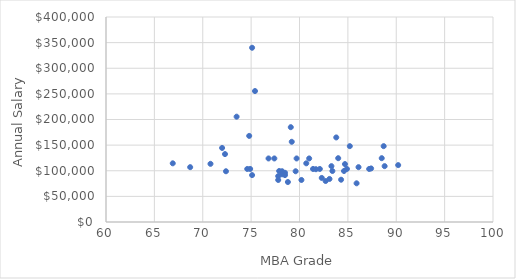
| Category | Annual Salary |
|---|---|
| 90.2 | 111000 |
| 68.7 | 107000 |
| 83.3 | 109000 |
| 88.7 | 148000 |
| 75.4 | 255500 |
| 82.1 | 103500 |
| 66.9 | 114500 |
| 76.8 | 124000 |
| 72.3 | 132500 |
| 72.4 | 99000 |
| 81.0 | 124000 |
| 77.8 | 82000 |
| 79.1 | 185000 |
| 77.8 | 89500 |
| 75.1 | 91500 |
| 70.8 | 113500 |
| 79.6 | 99000 |
| 85.9 | 75500 |
| 82.3 | 86000 |
| 79.2 | 156500 |
| 83.4 | 99500 |
| 85.2 | 148000 |
| 80.2 | 82000 |
| 87.2 | 103500 |
| 73.5 | 205500 |
| 74.6 | 103500 |
| 75.1 | 340000 |
| 74.9 | 103500 |
| 84.6 | 99500 |
| 81.7 | 103000 |
| 81.4 | 103500 |
| 83.8 | 165000 |
| 88.5 | 124500 |
| 84.9 | 103500 |
| 84.3 | 82500 |
| 78.2 | 93000 |
| 74.8 | 168000 |
| 78.5 | 96000 |
| 82.7 | 80000 |
| 84.0 | 124500 |
| 78.2 | 99000 |
| 79.7 | 124000 |
| 78.5 | 91500 |
| 72.0 | 144500 |
| 80.7 | 114500 |
| 87.4 | 104500 |
| 77.4 | 124000 |
| 84.7 | 113000 |
| 78.8 | 78000 |
| 88.8 | 109000 |
| 77.9 | 99500 |
| 86.1 | 107000 |
| 83.1 | 84000 |